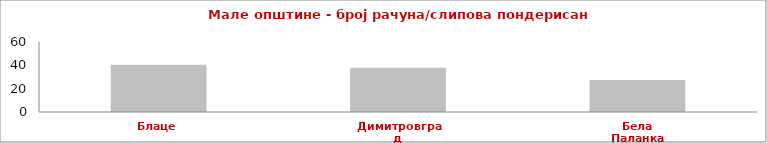
| Category | Series 0 |
|---|---|
| Блаце | 40.45 |
| Димитровград | 37.884 |
| Бела Паланка | 27.396 |